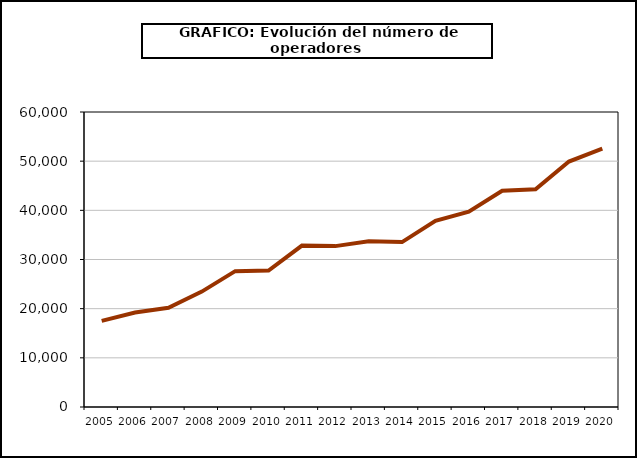
| Category | Operadores (*) |
|---|---|
| 2005.0 | 17509 |
| 2006.0 | 19211 |
| 2007.0 | 20171 |
| 2008.0 | 23473 |
| 2009.0 | 27627 |
| 2010.0 | 27767 |
| 2011.0 | 32837 |
| 2012.0 | 32724 |
| 2013.0 | 33704 |
| 2014.0 | 33539 |
| 2015.0 | 37870 |
| 2016.0 | 39744 |
| 2017.0 | 43984 |
| 2018.0 | 44282 |
| 2019.0 | 49918 |
| 2020.0 | 52557 |